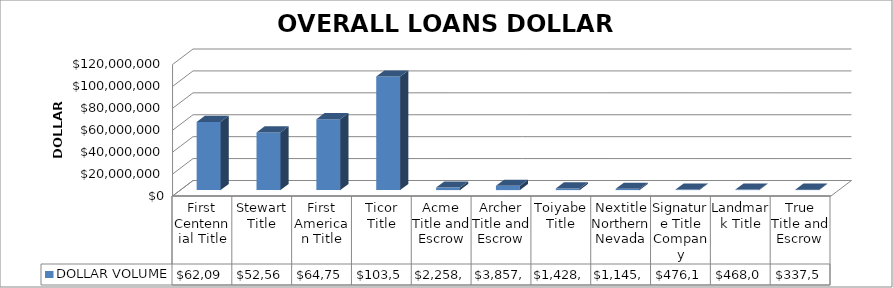
| Category | DOLLAR VOLUME |
|---|---|
| First Centennial Title | 62093929.89 |
| Stewart Title | 52566768.74 |
| First American Title | 64751118.91 |
| Ticor Title | 103577246 |
| Acme Title and Escrow | 2258738 |
| Archer Title and Escrow | 3857475 |
| Toiyabe Title | 1428716 |
| Nextitle Northern Nevada | 1145237 |
| Signature Title Company | 476190 |
| Landmark Title | 468000 |
| True Title and Escrow | 337500 |